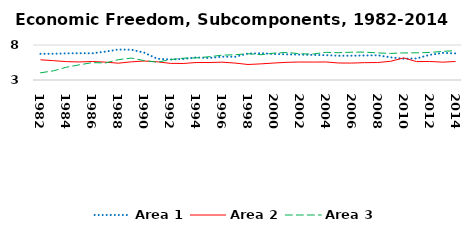
| Category | Area 1 | Area 2 | Area 3 |
|---|---|---|---|
| 1982.0 | 6.738 | 5.882 | 4.028 |
| 1983.0 | 6.75 | 5.764 | 4.31 |
| 1984.0 | 6.803 | 5.623 | 4.825 |
| 1985.0 | 6.829 | 5.58 | 5.169 |
| 1986.0 | 6.812 | 5.643 | 5.484 |
| 1987.0 | 7.052 | 5.556 | 5.431 |
| 1988.0 | 7.351 | 5.402 | 5.904 |
| 1989.0 | 7.33 | 5.596 | 6.131 |
| 1990.0 | 6.907 | 5.711 | 5.773 |
| 1991.0 | 6.042 | 5.601 | 5.546 |
| 1992.0 | 5.93 | 5.379 | 5.911 |
| 1993.0 | 6.004 | 5.358 | 6.109 |
| 1994.0 | 6.221 | 5.497 | 6.161 |
| 1995.0 | 6.143 | 5.498 | 6.323 |
| 1996.0 | 6.332 | 5.547 | 6.547 |
| 1997.0 | 6.317 | 5.421 | 6.611 |
| 1998.0 | 6.78 | 5.216 | 6.753 |
| 1999.0 | 6.829 | 5.305 | 6.61 |
| 2000.0 | 6.717 | 5.426 | 6.836 |
| 2001.0 | 6.67 | 5.526 | 6.939 |
| 2002.0 | 6.624 | 5.571 | 6.748 |
| 2003.0 | 6.585 | 5.562 | 6.706 |
| 2004.0 | 6.547 | 5.575 | 6.955 |
| 2005.0 | 6.47 | 5.428 | 6.901 |
| 2006.0 | 6.468 | 5.418 | 6.974 |
| 2007.0 | 6.503 | 5.477 | 6.988 |
| 2008.0 | 6.528 | 5.497 | 6.867 |
| 2009.0 | 6.236 | 5.673 | 6.798 |
| 2010.0 | 6.035 | 6.156 | 6.87 |
| 2011.0 | 6.082 | 5.627 | 6.884 |
| 2012.0 | 6.588 | 5.649 | 6.935 |
| 2013.0 | 6.871 | 5.547 | 7.084 |
| 2014.0 | 6.799 | 5.646 | 7.204 |